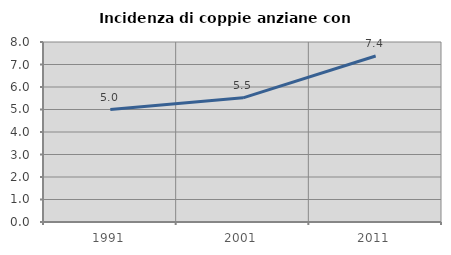
| Category | Incidenza di coppie anziane con figli |
|---|---|
| 1991.0 | 5 |
| 2001.0 | 5.517 |
| 2011.0 | 7.377 |